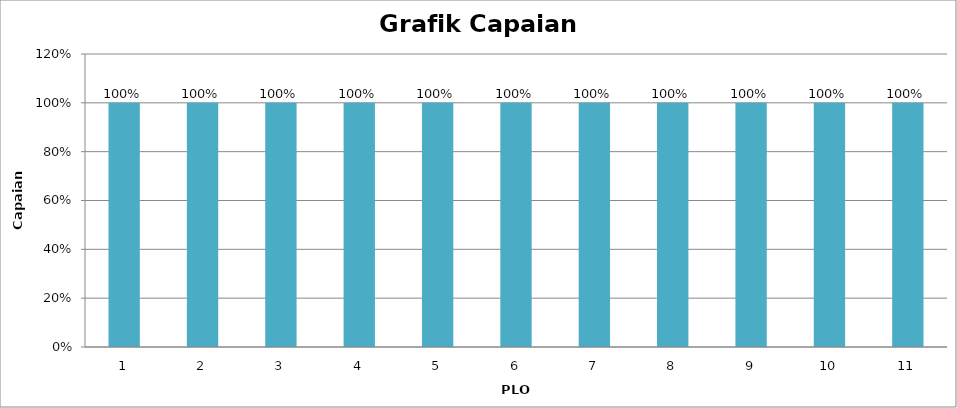
| Category | Series 0 |
|---|---|
| 0 | 1 |
| 1 | 1 |
| 2 | 1 |
| 3 | 1 |
| 4 | 1 |
| 5 | 1 |
| 6 | 1 |
| 7 | 1 |
| 8 | 1 |
| 9 | 1 |
| 10 | 1 |